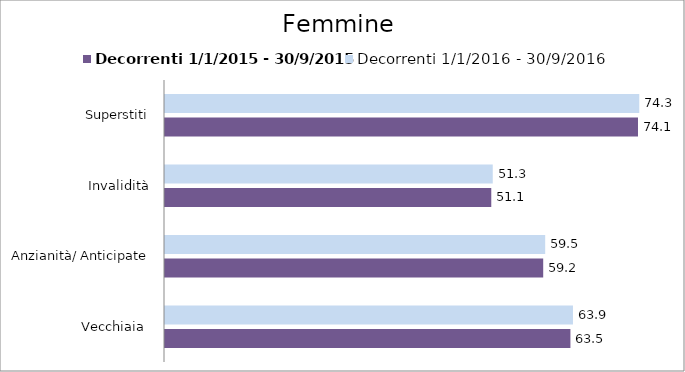
| Category | Decorrenti 1/1/2015 - 30/9/2015 | Decorrenti 1/1/2016 - 30/9/2016 |
|---|---|---|
| Vecchiaia  | 63.47 | 63.87 |
| Anzianità/ Anticipate | 59.21 | 59.52 |
| Invalidità | 51.08 | 51.31 |
| Superstiti | 74.05 | 74.25 |